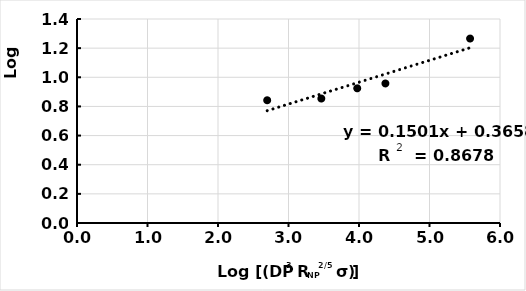
| Category | Series 0 |
|---|---|
| 5.575579364340733 | 1.266 |
| 4.374594575900986 | 0.958 |
| 3.9749465929729086 | 0.924 |
| 3.4658742445945774 | 0.854 |
| 2.6976321139610584 | 0.842 |